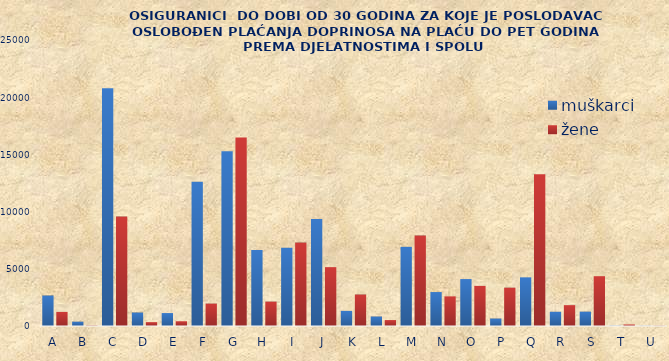
| Category | muškarci | žene |
|---|---|---|
| A | 2666 | 1232 |
| B | 379 | 36 |
| C | 20781 | 9565 |
| D | 1179 | 337 |
| E | 1131 | 415 |
| F | 12607 | 1959 |
| G | 15270 | 16483 |
| H | 6642 | 2134 |
| I | 6840 | 7295 |
| J | 9362 | 5144 |
| K | 1322 | 2753 |
| L | 830 | 519 |
| M | 6920 | 7900 |
| N | 2968 | 2591 |
| O | 4102 | 3506 |
| P | 653 | 3352 |
| Q | 4253 | 13256 |
| R | 1244 | 1822 |
| S | 1254 | 4353 |
| T | 25 | 134 |
| U | 15 | 20 |